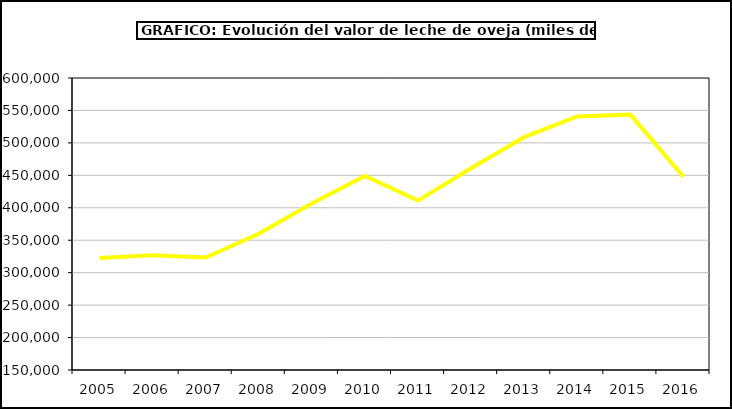
| Category | Leche de oveja |
|---|---|
| 2005.0 | 322582.171 |
| 2006.0 | 326990.283 |
| 2007.0 | 323333.143 |
| 2008.0 | 359891.921 |
| 2009.0 | 406748.92 |
| 2010.0 | 448909.954 |
| 2011.0 | 411088.68 |
| 2012.0 | 461020.54 |
| 2013.0 | 508804.544 |
| 2014.0 | 540718.294 |
| 2015.0 | 543554.103 |
| 2016.0 | 447762.031 |